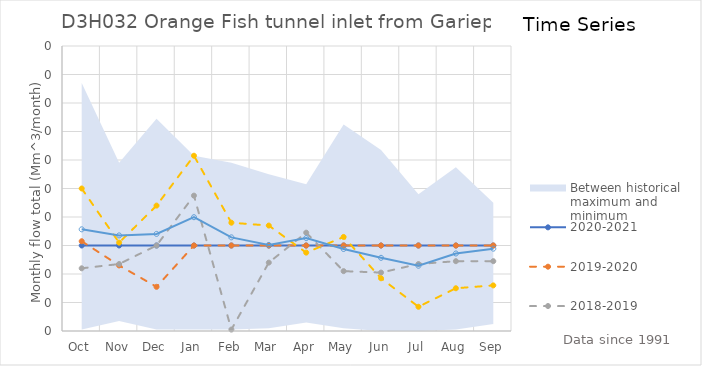
| Category | 2020-2021 | 2019-2020 | 2018-2019 | 2017-2018 | Mean total series |
|---|---|---|---|---|---|
| Oct | 0.06 | 0.063 | 0.044 | 0.1 | 0.071 |
| Nov | 0.06 | 0.046 | 0.047 | 0.062 | 0.067 |
| Dec | 0.06 | 0.031 | 0.06 | 0.088 | 0.068 |
| Jan | 0.06 | 0.06 | 0.095 | 0.123 | 0.08 |
| Feb | 0.06 | 0.06 | 0.001 | 0.076 | 0.066 |
| Mar | 0.06 | 0.06 | 0.048 | 0.074 | 0.06 |
| Apr | 0.06 | 0.06 | 0.069 | 0.055 | 0.065 |
| May | 0.06 | 0.06 | 0.042 | 0.066 | 0.058 |
| Jun | 0.06 | 0.06 | 0.041 | 0.037 | 0.051 |
| Jul | 0.06 | 0.06 | 0.047 | 0.017 | 0.046 |
| Aug | 0.06 | 0.06 | 0.049 | 0.03 | 0.054 |
| Sep | 0.06 | 0.06 | 0.049 | 0.032 | 0.058 |